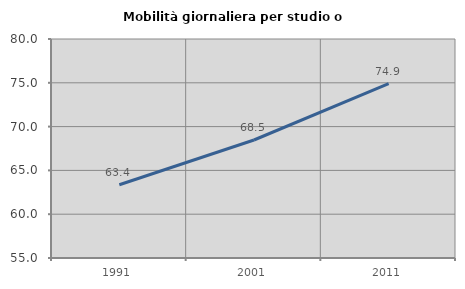
| Category | Mobilità giornaliera per studio o lavoro |
|---|---|
| 1991.0 | 63.366 |
| 2001.0 | 68.47 |
| 2011.0 | 74.91 |